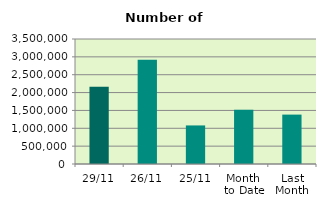
| Category | Series 0 |
|---|---|
| 29/11 | 2161608 |
| 26/11 | 2918374 |
| 25/11 | 1079864 |
| Month 
to Date | 1516354.952 |
| Last
Month | 1383348.571 |